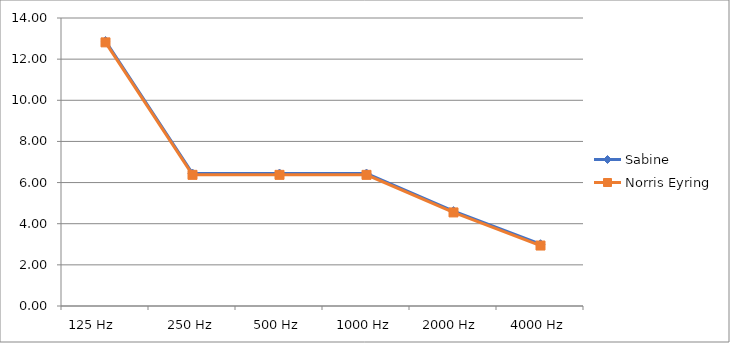
| Category | Sabine | Norris Eyring |
|---|---|---|
| 125 Hz      | 12.88 | 12.815 |
| 250 Hz | 6.44 | 6.375 |
| 500 Hz | 6.44 | 6.375 |
| 1000 Hz | 6.44 | 6.375 |
| 2000 Hz | 4.613 | 4.548 |
| 4000 Hz | 3.004 | 2.939 |